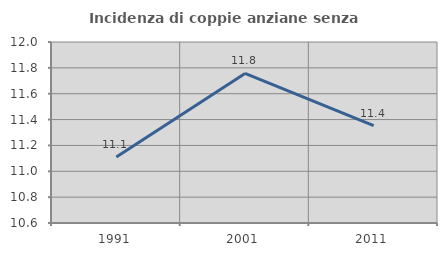
| Category | Incidenza di coppie anziane senza figli  |
|---|---|
| 1991.0 | 11.111 |
| 2001.0 | 11.757 |
| 2011.0 | 11.353 |